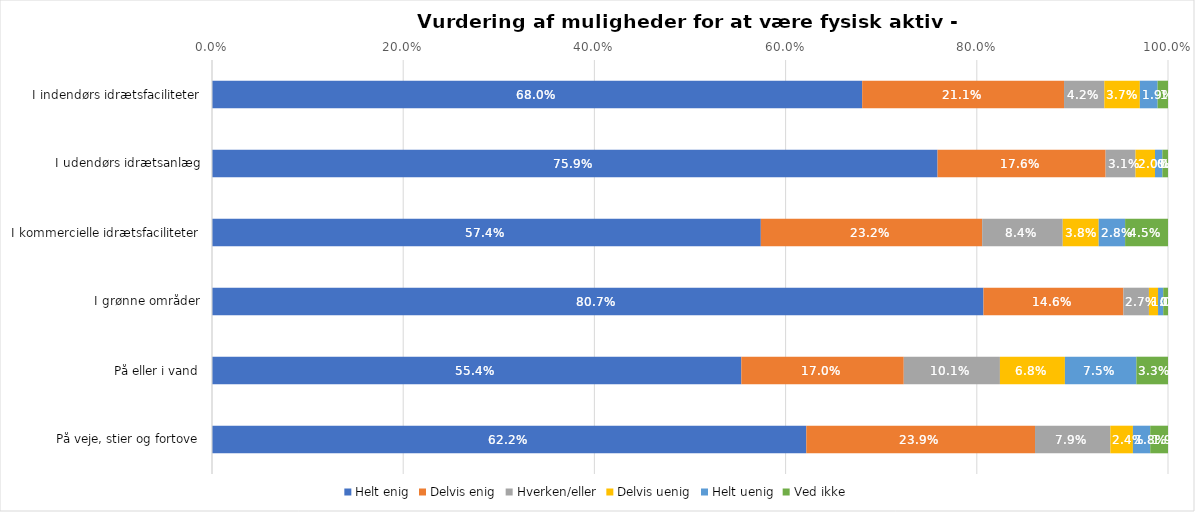
| Category | Helt enig | Delvis enig | Hverken/eller | Delvis uenig | Helt uenig | Ved ikke |
|---|---|---|---|---|---|---|
| I indendørs idrætsfaciliteter | 0.68 | 0.211 | 0.042 | 0.037 | 0.019 | 0.011 |
| I udendørs idrætsanlæg | 0.759 | 0.176 | 0.031 | 0.02 | 0.008 | 0.006 |
| I kommercielle idrætsfaciliteter | 0.574 | 0.232 | 0.084 | 0.038 | 0.028 | 0.045 |
| I grønne områder | 0.807 | 0.146 | 0.027 | 0.01 | 0.005 | 0.005 |
| På eller i vand | 0.554 | 0.17 | 0.101 | 0.068 | 0.075 | 0.033 |
| På veje, stier og fortove | 0.622 | 0.239 | 0.079 | 0.024 | 0.018 | 0.019 |